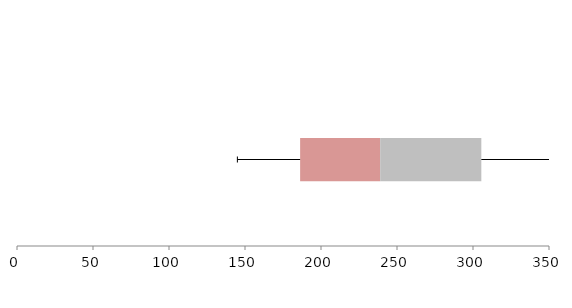
| Category | Series 1 | Series 2 | Series 3 |
|---|---|---|---|
| 0 | 186.265 | 52.675 | 66.54 |